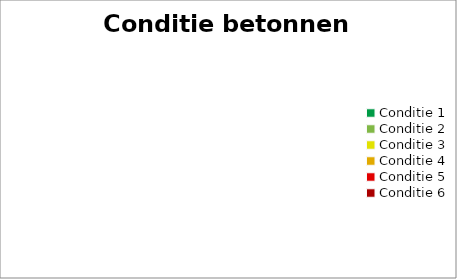
| Category | Conditie betonnen balken |
|---|---|
| Conditie 1 | 0 |
| Conditie 2 | 0 |
| Conditie 3 | 0 |
| Conditie 4 | 0 |
| Conditie 5 | 0 |
| Conditie 6 | 0 |